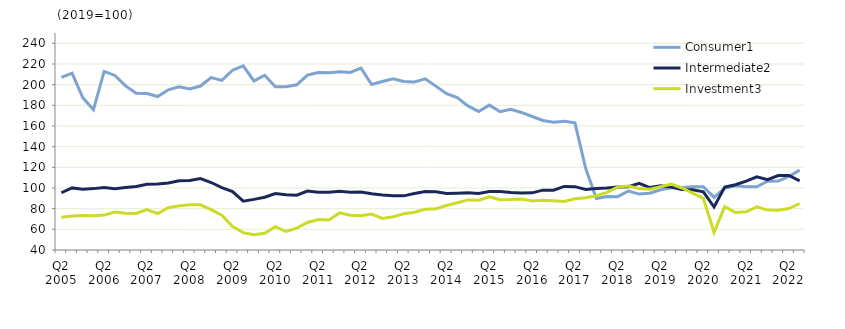
| Category | Consumer1 | Intermediate2 | Investment3 |
|---|---|---|---|
| Q2 2005 | 207.1 | 95.4 | 71.8 |
|  | 211.2 | 100.1 | 72.8 |
| Q4 2005 | 187.5 | 98.9 | 73.5 |
|  | 175.8 | 99.4 | 73.1 |
| Q2 2006 | 212.8 | 100.4 | 73.8 |
|  | 208.9 | 99.3 | 76.7 |
| Q4 2006 | 198.8 | 100.5 | 75.5 |
|  | 191.6 | 101.5 | 75.4 |
| Q2 2007 | 191.4 | 103.6 | 79.2 |
|  | 188.5 | 103.8 | 75.2 |
| Q4 2007 | 195 | 104.9 | 80.9 |
|  | 198 | 107.1 | 82.7 |
| Q2 2008 | 195.9 | 107.3 | 83.9 |
|  | 198.7 | 109.1 | 83.7 |
| Q4 2008 | 206.9 | 105.3 | 79.1 |
|  | 204.1 | 100.3 | 73.7 |
| Q2 2009 | 214 | 96.5 | 62.8 |
|  | 218.2 | 87.3 | 56.8 |
| Q4 2009 | 203.6 | 89 | 54.8 |
|  | 209.1 | 91.1 | 56.2 |
| Q2 2010 | 197.9 | 94.7 | 62.6 |
|  | 197.9 | 93.4 | 57.9 |
| Q4 2010 | 199.9 | 93 | 61.1 |
|  | 209.2 | 97.1 | 66.6 |
| Q2 2011 | 211.7 | 95.9 | 69.5 |
|  | 211.5 | 95.9 | 69 |
| Q4 2011 | 212.4 | 96.8 | 75.9 |
|  | 211.8 | 96 | 73.7 |
| Q2 2012 | 216 | 96.2 | 73.1 |
|  | 200.1 | 94.4 | 74.8 |
| Q4 2012 | 203 | 93.3 | 70.6 |
|  | 205.7 | 92.5 | 72.1 |
| Q2 2013 | 203.1 | 92.4 | 75 |
|  | 202.7 | 94.6 | 76.6 |
| Q4 2013 | 205.7 | 96.5 | 79.4 |
|  | 198.6 | 96.4 | 79.9 |
| Q2 2014 | 191.2 | 94.6 | 83 |
|  | 187.4 | 95 | 85.7 |
| Q4 2014 | 179.4 | 95.5 | 88.5 |
|  | 174.1 | 94.7 | 88.1 |
| Q2 2015 | 180.2 | 96.6 | 91.5 |
|  | 173.8 | 96.7 | 88.6 |
| Q4 2015 | 176.2 | 95.6 | 88.8 |
|  | 173.1 | 95.2 | 89.3 |
| Q2 2016 | 169.2 | 95.3 | 87.5 |
|  | 165.4 | 97.9 | 88.2 |
| Q4 2016 | 163.7 | 97.8 | 87.7 |
|  | 164.7 | 101.5 | 87 |
| Q2 2017 | 163 | 101.3 | 89.5 |
|  | 119.1 | 98.5 | 90.6 |
| Q4 2017 | 89.9 | 99.5 | 92.5 |
|  | 91.8 | 100 | 95.7 |
| Q2 2018 | 91.6 | 101 | 101.1 |
|  | 97.1 | 101.2 | 101.9 |
| Q4 2018 | 94.1 | 104.6 | 99.5 |
|  | 95 | 100.4 | 98.8 |
| Q2 2019 | 98.3 | 102.2 | 101.3 |
|  | 100.1 | 101 | 103.7 |
| Q4 2019 | 100.6 | 98.5 | 100 |
|  | 101.1 | 98.2 | 95 |
| Q2 2020 | 101.2 | 96.3 | 89.9 |
|  | 90.9 | 81.6 | 57 |
| Q4 2020 | 99.8 | 101 | 82 |
|  | 102.1 | 103.2 | 76.3 |
| Q2 2021 | 101.2 | 106.7 | 77 |
|  | 101.1 | 110.8 | 81.8 |
| Q4 2021 | 106.6 | 108.1 | 78.6 |
|  | 106.7 | 112 | 78.4 |
| Q2 2022 | 111.2 | 112.1 | 80.1 |